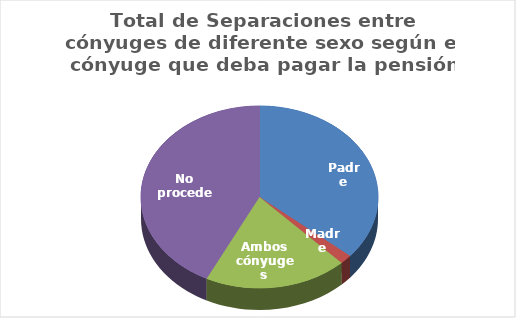
| Category | Series 0 |
|---|---|
| Padre | 1003 |
| Madre | 46 |
| Ambos cónyuges | 540 |
| No procede | 1182 |